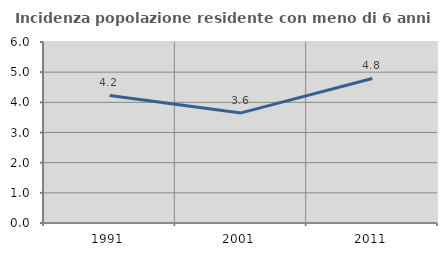
| Category | Incidenza popolazione residente con meno di 6 anni |
|---|---|
| 1991.0 | 4.228 |
| 2001.0 | 3.65 |
| 2011.0 | 4.79 |